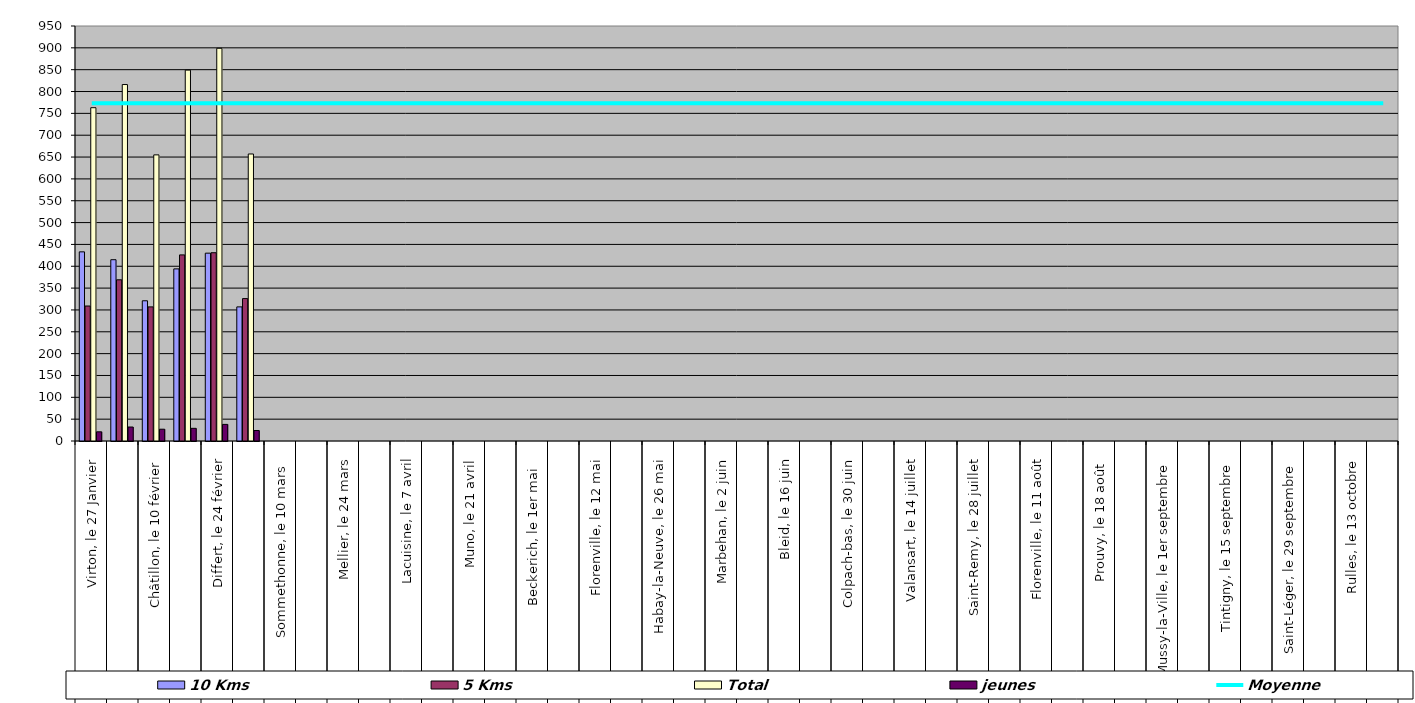
| Category | 10 Kms | 5 Kms | Total | jeunes |
|---|---|---|---|---|
| 0 | 433 | 309 | 763 | 21 |
| 1 | 415 | 369 | 816 | 32 |
| 2 | 321 | 307 | 655 | 27 |
| 3 | 394 | 426 | 849 | 29 |
| 4 | 430 | 431 | 899 | 38 |
| 5 | 307 | 326 | 657 | 24 |
| 6 | 0 | 0 | 0 | 0 |
| 7 | 0 | 0 | 0 | 0 |
| 8 | 0 | 0 | 0 | 0 |
| 9 | 0 | 0 | 0 | 0 |
| 10 | 0 | 0 | 0 | 0 |
| 11 | 0 | 0 | 0 | 0 |
| 12 | 0 | 0 | 0 | 0 |
| 13 | 0 | 0 | 0 | 0 |
| 14 | 0 | 0 | 0 | 0 |
| 15 | 0 | 0 | 0 | 0 |
| 16 | 0 | 0 | 0 | 0 |
| 17 | 0 | 0 | 0 | 0 |
| 18 | 0 | 0 | 0 | 0 |
| 19 | 0 | 0 | 0 | 0 |
| 20 | 0 | 0 | 0 | 0 |
| 21 | 0 | 0 | 0 | 0 |
| 22 | 0 | 0 | 0 | 0 |
| 23 | 0 | 0 | 0 | 0 |
| 24 | 0 | 0 | 0 | 0 |
| 25 | 0 | 0 | 0 | 0 |
| 26 | 0 | 0 | 0 | 0 |
| 27 | 0 | 0 | 0 | 0 |
| 28 | 0 | 0 | 0 | 0 |
| 29 | 0 | 0 | 0 | 0 |
| 30 | 0 | 0 | 0 | 0 |
| 31 | 0 | 0 | 0 | 0 |
| 32 | 0 | 0 | 0 | 0 |
| 33 | 0 | 0 | 0 | 0 |
| 34 | 0 | 0 | 0 | 0 |
| 35 | 0 | 0 | 0 | 0 |
| 36 | 0 | 0 | 0 | 0 |
| 37 | 0 | 0 | 0 | 0 |
| 38 | 0 | 0 | 0 | 0 |
| 39 | 0 | 0 | 0 | 0 |
| 40 | 0 | 0 | 0 | 0 |
| 41 | 0 | 0 | 0 | 0 |